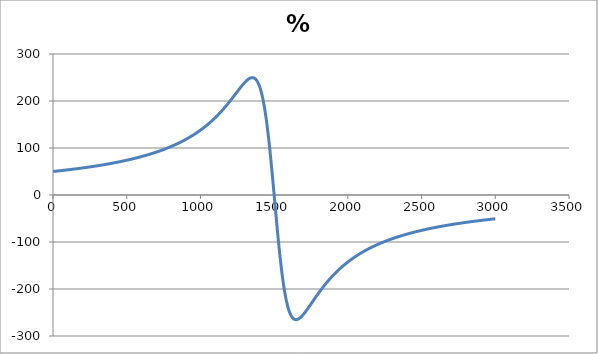
| Category | % Torque |
|---|---|
| 0.0 | 50.053 |
| 7.500000000000007 | 50.299 |
| 15.000000000000014 | 50.546 |
| 22.50000000000002 | 50.796 |
| 30.00000000000003 | 51.049 |
| 37.500000000000036 | 51.304 |
| 45.00000000000004 | 51.561 |
| 52.50000000000005 | 51.821 |
| 60.00000000000006 | 52.084 |
| 67.50000000000006 | 52.349 |
| 75.00000000000007 | 52.617 |
| 82.50000000000007 | 52.888 |
| 90.00000000000009 | 53.161 |
| 97.50000000000009 | 53.437 |
| 105.0000000000001 | 53.716 |
| 112.5000000000001 | 53.998 |
| 120.00000000000011 | 54.283 |
| 127.50000000000011 | 54.571 |
| 135.0000000000001 | 54.862 |
| 142.5000000000001 | 55.156 |
| 150.00000000000014 | 55.454 |
| 157.50000000000014 | 55.754 |
| 165.00000000000014 | 56.058 |
| 172.50000000000014 | 56.364 |
| 180.00000000000017 | 56.675 |
| 187.50000000000017 | 56.988 |
| 195.00000000000017 | 57.305 |
| 202.50000000000017 | 57.626 |
| 210.0000000000002 | 57.95 |
| 217.5000000000002 | 58.278 |
| 225.0000000000002 | 58.609 |
| 232.5000000000002 | 58.944 |
| 240.00000000000023 | 59.283 |
| 247.50000000000023 | 59.626 |
| 255.00000000000023 | 59.973 |
| 262.5000000000002 | 60.323 |
| 270.0000000000002 | 60.678 |
| 277.5000000000002 | 61.037 |
| 285.0000000000002 | 61.4 |
| 292.5000000000003 | 61.767 |
| 300.0000000000003 | 62.139 |
| 307.5000000000003 | 62.515 |
| 315.0000000000003 | 62.896 |
| 322.5000000000003 | 63.281 |
| 330.0000000000003 | 63.671 |
| 337.5000000000003 | 64.066 |
| 345.0000000000003 | 64.465 |
| 352.50000000000034 | 64.87 |
| 360.00000000000034 | 65.279 |
| 367.50000000000034 | 65.694 |
| 375.00000000000034 | 66.114 |
| 382.50000000000034 | 66.539 |
| 390.00000000000034 | 66.969 |
| 397.50000000000034 | 67.405 |
| 405.00000000000034 | 67.847 |
| 412.50000000000034 | 68.294 |
| 420.0000000000004 | 68.747 |
| 427.5000000000004 | 69.206 |
| 435.0000000000004 | 69.671 |
| 442.5000000000004 | 70.142 |
| 450.0000000000004 | 70.62 |
| 457.5000000000004 | 71.104 |
| 465.0000000000004 | 71.594 |
| 472.5000000000004 | 72.091 |
| 480.00000000000045 | 72.595 |
| 487.50000000000045 | 73.106 |
| 495.00000000000045 | 73.624 |
| 502.50000000000045 | 74.149 |
| 510.00000000000045 | 74.681 |
| 517.5000000000005 | 75.221 |
| 525.0000000000005 | 75.769 |
| 532.5000000000005 | 76.325 |
| 540.0000000000005 | 76.888 |
| 547.5000000000005 | 77.46 |
| 555.0000000000005 | 78.04 |
| 562.5000000000005 | 78.628 |
| 570.0000000000005 | 79.225 |
| 577.5000000000006 | 79.831 |
| 585.0000000000006 | 80.446 |
| 592.5000000000006 | 81.071 |
| 600.0000000000006 | 81.705 |
| 607.5000000000006 | 82.348 |
| 615.0000000000006 | 83.002 |
| 622.5000000000006 | 83.665 |
| 630.0000000000006 | 84.339 |
| 637.5000000000006 | 85.024 |
| 645.0000000000006 | 85.719 |
| 652.5000000000006 | 86.426 |
| 660.0000000000006 | 87.144 |
| 667.5000000000006 | 87.873 |
| 675.0000000000006 | 88.614 |
| 682.5000000000006 | 89.368 |
| 690.0000000000006 | 90.134 |
| 697.5000000000006 | 90.912 |
| 705.0000000000007 | 91.704 |
| 712.5000000000007 | 92.509 |
| 720.0000000000007 | 93.328 |
| 727.5000000000007 | 94.16 |
| 735.0000000000007 | 95.007 |
| 742.5000000000007 | 95.869 |
| 750.0000000000007 | 96.746 |
| 757.5000000000007 | 97.638 |
| 765.0000000000007 | 98.546 |
| 772.5000000000007 | 99.471 |
| 780.0000000000007 | 100.412 |
| 787.5000000000007 | 101.37 |
| 795.0000000000007 | 102.346 |
| 802.5000000000007 | 103.339 |
| 810.0000000000007 | 104.351 |
| 817.5000000000007 | 105.382 |
| 825.0000000000007 | 106.433 |
| 832.5000000000008 | 107.503 |
| 840.0000000000008 | 108.594 |
| 847.5000000000008 | 109.706 |
| 855.0000000000008 | 110.839 |
| 862.5000000000008 | 111.995 |
| 870.0000000000008 | 113.173 |
| 877.5000000000008 | 114.374 |
| 885.0000000000008 | 115.6 |
| 892.5000000000008 | 116.85 |
| 900.0000000000008 | 118.126 |
| 907.5000000000008 | 119.427 |
| 915.0000000000008 | 120.756 |
| 922.5000000000008 | 122.112 |
| 930.0000000000008 | 123.496 |
| 937.5000000000008 | 124.909 |
| 945.0000000000008 | 126.351 |
| 952.5000000000008 | 127.825 |
| 960.0000000000009 | 129.33 |
| 967.5000000000009 | 130.867 |
| 975.0000000000009 | 132.437 |
| 982.5000000000009 | 134.042 |
| 990.0000000000009 | 135.682 |
| 997.5000000000009 | 137.357 |
| 1005.0000000000009 | 139.07 |
| 1012.5000000000009 | 140.82 |
| 1020.0000000000009 | 142.61 |
| 1027.500000000001 | 144.439 |
| 1035.000000000001 | 146.309 |
| 1042.500000000001 | 148.222 |
| 1050.000000000001 | 150.177 |
| 1057.500000000001 | 152.177 |
| 1065.000000000001 | 154.221 |
| 1072.500000000001 | 156.311 |
| 1080.000000000001 | 158.449 |
| 1087.500000000001 | 160.634 |
| 1095.000000000001 | 162.869 |
| 1102.500000000001 | 165.153 |
| 1110.000000000001 | 167.487 |
| 1117.500000000001 | 169.873 |
| 1125.000000000001 | 172.311 |
| 1132.500000000001 | 174.8 |
| 1140.000000000001 | 177.342 |
| 1147.500000000001 | 179.937 |
| 1155.0000000000011 | 182.584 |
| 1162.5000000000011 | 185.283 |
| 1170.0000000000011 | 188.033 |
| 1177.5000000000011 | 190.832 |
| 1185.0000000000011 | 193.681 |
| 1192.5000000000011 | 196.575 |
| 1200.0000000000011 | 199.513 |
| 1207.5000000000011 | 202.491 |
| 1215.0000000000011 | 205.504 |
| 1222.5000000000011 | 208.547 |
| 1230.0000000000011 | 211.614 |
| 1237.5000000000011 | 214.696 |
| 1245.0000000000011 | 217.784 |
| 1252.5000000000011 | 220.867 |
| 1260.0000000000011 | 223.931 |
| 1267.5000000000011 | 226.96 |
| 1275.0000000000011 | 229.935 |
| 1282.5000000000011 | 232.835 |
| 1290.0000000000011 | 235.634 |
| 1297.5000000000011 | 238.301 |
| 1305.0000000000011 | 240.803 |
| 1312.5000000000011 | 243.098 |
| 1320.0000000000011 | 245.142 |
| 1327.5000000000011 | 246.88 |
| 1335.0000000000011 | 248.252 |
| 1342.5000000000011 | 249.189 |
| 1350.0000000000011 | 249.614 |
| 1357.5000000000011 | 249.439 |
| 1365.0000000000011 | 248.569 |
| 1372.5000000000011 | 246.896 |
| 1380.0000000000011 | 244.305 |
| 1387.5000000000011 | 240.671 |
| 1395.0000000000011 | 235.864 |
| 1402.5000000000011 | 229.749 |
| 1410.0000000000014 | 222.192 |
| 1417.5000000000014 | 213.064 |
| 1425.0000000000014 | 202.245 |
| 1432.5000000000014 | 189.638 |
| 1440.0000000000014 | 175.171 |
| 1447.5000000000014 | 158.814 |
| 1455.0000000000014 | 140.578 |
| 1462.5000000000014 | 120.536 |
| 1470.0000000000014 | 98.817 |
| 1477.5000000000011 | 75.618 |
| 1485.0000000000011 | 51.198 |
| 1492.5000000000011 | 25.872 |
| 1500.0000000000014 | 0 |
| 1507.5000000000011 | -26.031 |
| 1515.0000000000014 | -51.822 |
| 1522.5000000000011 | -76.987 |
| 1530.0000000000014 | -101.167 |
| 1537.5000000000011 | -124.051 |
| 1545.0000000000014 | -145.383 |
| 1552.5000000000011 | -164.972 |
| 1560.0000000000014 | -182.694 |
| 1567.5000000000011 | -198.486 |
| 1575.0000000000011 | -212.34 |
| 1582.5000000000011 | -224.297 |
| 1590.0000000000011 | -234.437 |
| 1597.5000000000014 | -242.866 |
| 1605.0000000000011 | -249.709 |
| 1612.5000000000014 | -255.103 |
| 1620.0000000000011 | -259.19 |
| 1627.5000000000014 | -262.108 |
| 1635.0000000000011 | -263.995 |
| 1642.5000000000014 | -264.977 |
| 1650.0000000000011 | -265.173 |
| 1657.5000000000014 | -264.694 |
| 1665.0000000000011 | -263.637 |
| 1672.5000000000014 | -262.09 |
| 1680.0000000000011 | -260.132 |
| 1687.5000000000014 | -257.832 |
| 1695.0000000000011 | -255.252 |
| 1702.5000000000014 | -252.443 |
| 1710.0000000000011 | -249.451 |
| 1717.5000000000014 | -246.317 |
| 1725.0000000000011 | -243.074 |
| 1732.5000000000014 | -239.751 |
| 1740.0000000000011 | -236.373 |
| 1747.5000000000014 | -232.962 |
| 1755.0000000000011 | -229.535 |
| 1762.5000000000014 | -226.107 |
| 1770.0000000000011 | -222.692 |
| 1777.5000000000014 | -219.298 |
| 1785.0000000000014 | -215.935 |
| 1792.5000000000014 | -212.611 |
| 1800.0000000000014 | -209.331 |
| 1807.5000000000014 | -206.099 |
| 1815.0000000000014 | -202.919 |
| 1822.5000000000014 | -199.795 |
| 1830.0000000000014 | -196.728 |
| 1837.5000000000014 | -193.72 |
| 1845.0000000000014 | -190.772 |
| 1852.5000000000016 | -187.884 |
| 1860.0000000000014 | -185.057 |
| 1867.5000000000016 | -182.291 |
| 1875.0000000000014 | -179.585 |
| 1882.5000000000016 | -176.939 |
| 1890.0000000000014 | -174.352 |
| 1897.5000000000016 | -171.824 |
| 1905.0000000000014 | -169.353 |
| 1912.5000000000016 | -166.938 |
| 1920.0000000000014 | -164.579 |
| 1927.5000000000016 | -162.274 |
| 1935.0000000000014 | -160.022 |
| 1942.5000000000016 | -157.822 |
| 1950.0000000000014 | -155.673 |
| 1957.5000000000016 | -153.573 |
| 1965.0000000000014 | -151.521 |
| 1972.5000000000016 | -149.516 |
| 1980.0000000000014 | -147.556 |
| 1987.5000000000016 | -145.641 |
| 1995.0000000000014 | -143.77 |
| 2002.5000000000016 | -141.94 |
| 2010.0000000000014 | -140.152 |
| 2017.5000000000016 | -138.403 |
| 2025.0000000000014 | -136.693 |
| 2032.5000000000016 | -135.021 |
| 2040.0000000000016 | -133.385 |
| 2047.5000000000016 | -131.785 |
| 2055.0000000000014 | -130.219 |
| 2062.500000000002 | -128.687 |
| 2070.0000000000014 | -127.188 |
| 2077.500000000002 | -125.72 |
| 2085.0000000000014 | -124.284 |
| 2092.500000000002 | -122.877 |
| 2100.0000000000014 | -121.5 |
| 2107.500000000002 | -120.151 |
| 2115.0000000000014 | -118.829 |
| 2122.500000000002 | -117.534 |
| 2130.0000000000014 | -116.266 |
| 2137.500000000002 | -115.023 |
| 2145.0000000000014 | -113.804 |
| 2152.500000000002 | -112.61 |
| 2160.0000000000014 | -111.439 |
| 2167.500000000002 | -110.29 |
| 2175.000000000002 | -109.164 |
| 2182.500000000002 | -108.059 |
| 2190.000000000002 | -106.975 |
| 2197.500000000002 | -105.912 |
| 2205.000000000002 | -104.869 |
| 2212.500000000002 | -103.844 |
| 2220.000000000002 | -102.839 |
| 2227.500000000002 | -101.852 |
| 2235.000000000002 | -100.883 |
| 2242.500000000002 | -99.932 |
| 2250.000000000002 | -98.997 |
| 2257.500000000002 | -98.079 |
| 2265.000000000002 | -97.178 |
| 2272.5000000000014 | -96.292 |
| 2280.000000000002 | -95.421 |
| 2287.500000000002 | -94.565 |
| 2295.000000000002 | -93.724 |
| 2302.5000000000014 | -92.898 |
| 2310.000000000002 | -92.085 |
| 2317.500000000002 | -91.285 |
| 2325.000000000002 | -90.499 |
| 2332.5000000000014 | -89.726 |
| 2340.000000000002 | -88.966 |
| 2347.500000000002 | -88.218 |
| 2355.000000000002 | -87.482 |
| 2362.500000000002 | -86.758 |
| 2370.000000000002 | -86.045 |
| 2377.500000000002 | -85.344 |
| 2385.000000000002 | -84.654 |
| 2392.500000000002 | -83.974 |
| 2400.000000000002 | -83.305 |
| 2407.500000000002 | -82.646 |
| 2415.000000000002 | -81.997 |
| 2422.500000000002 | -81.358 |
| 2430.000000000002 | -80.729 |
| 2437.500000000002 | -80.109 |
| 2445.000000000002 | -79.498 |
| 2452.500000000002 | -78.896 |
| 2460.000000000002 | -78.303 |
| 2467.500000000002 | -77.719 |
| 2475.000000000002 | -77.143 |
| 2482.500000000002 | -76.575 |
| 2490.000000000002 | -76.016 |
| 2497.5000000000023 | -75.464 |
| 2505.000000000002 | -74.921 |
| 2512.500000000002 | -74.384 |
| 2520.000000000002 | -73.856 |
| 2527.5000000000023 | -73.334 |
| 2535.000000000002 | -72.82 |
| 2542.500000000002 | -72.312 |
| 2550.000000000002 | -71.812 |
| 2557.5000000000023 | -71.318 |
| 2565.000000000002 | -70.831 |
| 2572.500000000002 | -70.351 |
| 2580.000000000002 | -69.876 |
| 2587.5000000000023 | -69.408 |
| 2595.000000000002 | -68.946 |
| 2602.500000000002 | -68.49 |
| 2610.000000000002 | -68.04 |
| 2617.5000000000023 | -67.596 |
| 2625.000000000002 | -67.157 |
| 2632.500000000002 | -66.724 |
| 2640.000000000002 | -66.297 |
| 2647.5000000000023 | -65.874 |
| 2655.000000000002 | -65.457 |
| 2662.500000000002 | -65.045 |
| 2670.000000000002 | -64.639 |
| 2677.5000000000023 | -64.237 |
| 2685.0000000000023 | -63.84 |
| 2692.500000000002 | -63.448 |
| 2700.0000000000023 | -63.06 |
| 2707.5000000000023 | -62.678 |
| 2715.0000000000023 | -62.299 |
| 2722.500000000002 | -61.925 |
| 2730.0000000000023 | -61.556 |
| 2737.5000000000023 | -61.191 |
| 2745.0000000000023 | -60.83 |
| 2752.500000000002 | -60.473 |
| 2760.0000000000023 | -60.121 |
| 2767.5000000000023 | -59.772 |
| 2775.0000000000023 | -59.428 |
| 2782.500000000002 | -59.087 |
| 2790.0000000000023 | -58.75 |
| 2797.5000000000023 | -58.417 |
| 2805.0000000000023 | -58.088 |
| 2812.500000000002 | -57.762 |
| 2820.0000000000023 | -57.44 |
| 2827.5000000000023 | -57.121 |
| 2835.0000000000023 | -56.806 |
| 2842.500000000002 | -56.494 |
| 2850.0000000000023 | -56.186 |
| 2857.5000000000023 | -55.881 |
| 2865.0000000000023 | -55.579 |
| 2872.5000000000023 | -55.28 |
| 2880.0000000000023 | -54.985 |
| 2887.5000000000023 | -54.693 |
| 2895.0000000000023 | -54.403 |
| 2902.5000000000023 | -54.117 |
| 2910.0000000000023 | -53.834 |
| 2917.5000000000023 | -53.553 |
| 2925.0000000000023 | -53.276 |
| 2932.5000000000023 | -53.001 |
| 2940.0000000000023 | -52.729 |
| 2947.5000000000023 | -52.46 |
| 2955.0000000000023 | -52.194 |
| 2962.5000000000023 | -51.93 |
| 2970.0000000000023 | -51.669 |
| 2977.5000000000023 | -51.41 |
| 2985.0000000000023 | -51.154 |
| 2992.5000000000023 | -50.9 |
| 3000.0000000000027 | -50.649 |